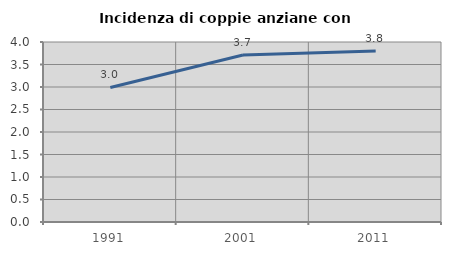
| Category | Incidenza di coppie anziane con figli |
|---|---|
| 1991.0 | 2.99 |
| 2001.0 | 3.71 |
| 2011.0 | 3.797 |